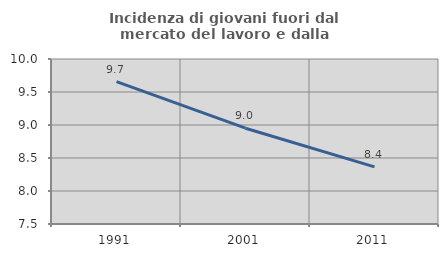
| Category | Incidenza di giovani fuori dal mercato del lavoro e dalla formazione  |
|---|---|
| 1991.0 | 9.656 |
| 2001.0 | 8.952 |
| 2011.0 | 8.366 |